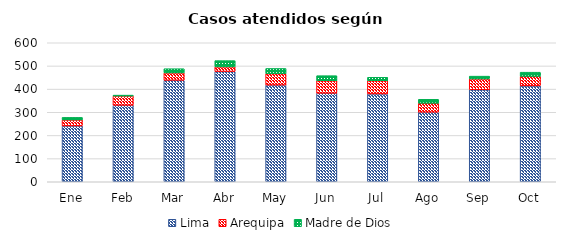
| Category | Lima | Arequipa | Madre de Dios |
|---|---|---|---|
| Ene | 241 | 26 | 11 |
| Feb | 330 | 40 | 4 |
| Mar | 438 | 32 | 18 |
| Abr | 476 | 20 | 27 |
| May | 417 | 50 | 22 |
| Jun | 382 | 54 | 22 |
| Jul | 379 | 57 | 15 |
| Ago | 300 | 39 | 17 |
| Sep | 397 | 47 | 12 |
| Oct | 414 | 41 | 18 |